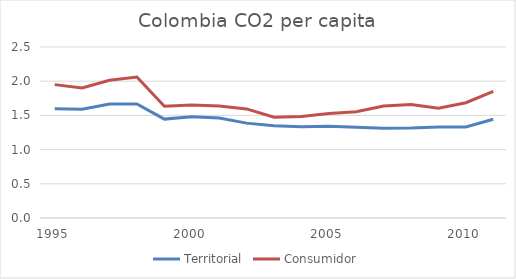
| Category | Territorial | Consumidor |
|---|---|---|
| 1995.0 | 1.596 | 1.95 |
| 1996.0 | 1.59 | 1.9 |
| 1997.0 | 1.668 | 2.014 |
| 1998.0 | 1.666 | 2.062 |
| 1999.0 | 1.446 | 1.634 |
| 2000.0 | 1.482 | 1.652 |
| 2001.0 | 1.462 | 1.638 |
| 2002.0 | 1.387 | 1.595 |
| 2003.0 | 1.349 | 1.473 |
| 2004.0 | 1.334 | 1.483 |
| 2005.0 | 1.343 | 1.529 |
| 2006.0 | 1.325 | 1.554 |
| 2007.0 | 1.313 | 1.636 |
| 2008.0 | 1.315 | 1.659 |
| 2009.0 | 1.329 | 1.606 |
| 2010.0 | 1.331 | 1.685 |
| 2011.0 | 1.443 | 1.852 |